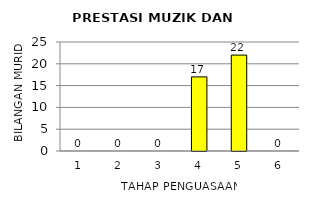
| Category | Series 0 |
|---|---|
| 1.0 | 0 |
| 2.0 | 0 |
| 3.0 | 0 |
| 4.0 | 17 |
| 5.0 | 22 |
| 6.0 | 0 |